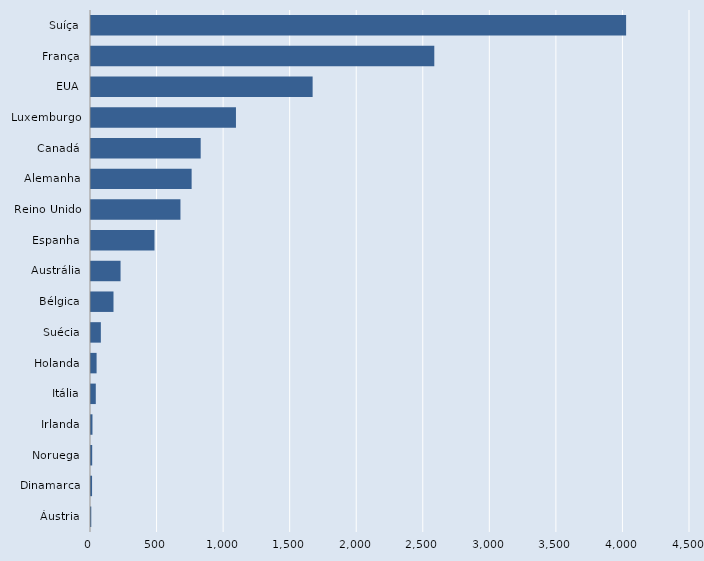
| Category | Series 0 |
|---|---|
| Áustria | 2 |
| Dinamarca | 8 |
| Noruega | 9 |
| Irlanda | 11 |
| Itália | 36 |
| Holanda | 42 |
| Suécia | 74 |
| Bélgica | 169 |
| Austrália | 222 |
| Espanha | 477 |
| Reino Unido | 672 |
| Alemanha | 756 |
| Canadá | 824 |
| Luxemburgo | 1089 |
| EUA | 1665 |
| França | 2579 |
| Suíça | 4020 |